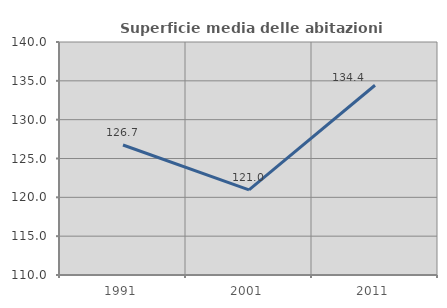
| Category | Superficie media delle abitazioni occupate |
|---|---|
| 1991.0 | 126.739 |
| 2001.0 | 120.962 |
| 2011.0 | 134.43 |